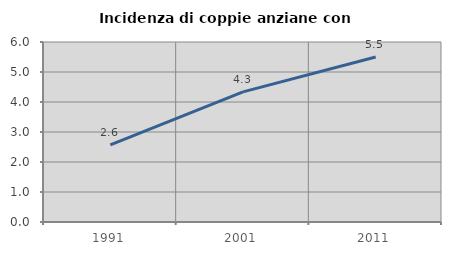
| Category | Incidenza di coppie anziane con figli |
|---|---|
| 1991.0 | 2.574 |
| 2001.0 | 4.338 |
| 2011.0 | 5.5 |